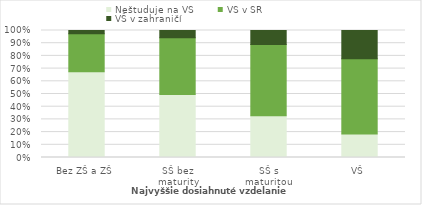
| Category | Neštuduje na VŠ | VŠ v SR | VŠ v zahraničí |
|---|---|---|---|
| Bez ZŠ a ZŠ | 952 | 422 | 36 |
| SŠ bez
maturity | 9115 | 8208 | 1038 |
| SŠ s
maturitou | 2033 | 3479 | 686 |
| VŠ | 1266 | 4034 | 1513 |